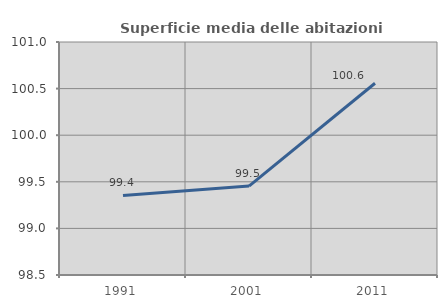
| Category | Superficie media delle abitazioni occupate |
|---|---|
| 1991.0 | 99.353 |
| 2001.0 | 99.454 |
| 2011.0 | 100.558 |